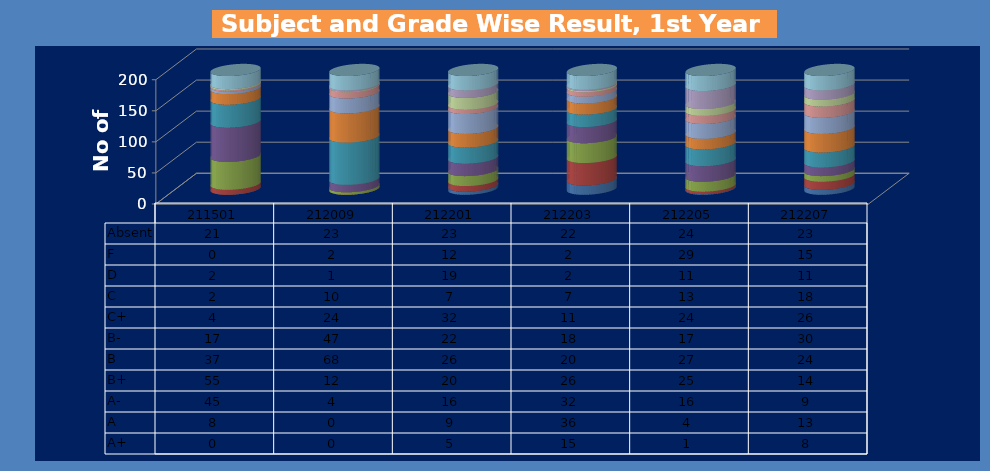
| Category | A+ | A | A- | B+ | B | B- | C+ | C | D | F | Absent |
|---|---|---|---|---|---|---|---|---|---|---|---|
| 211501.0 | 0 | 8 | 45 | 55 | 37 | 17 | 4 | 2 | 2 | 0 | 21 |
| 212009.0 | 0 | 0 | 4 | 12 | 68 | 47 | 24 | 10 | 1 | 2 | 23 |
| 212201.0 | 5 | 9 | 16 | 20 | 26 | 22 | 32 | 7 | 19 | 12 | 23 |
| 212203.0 | 15 | 36 | 32 | 26 | 20 | 18 | 11 | 7 | 2 | 2 | 22 |
| 212205.0 | 1 | 4 | 16 | 25 | 27 | 17 | 24 | 13 | 11 | 29 | 24 |
| 212207.0 | 8 | 13 | 9 | 14 | 24 | 30 | 26 | 18 | 11 | 15 | 23 |